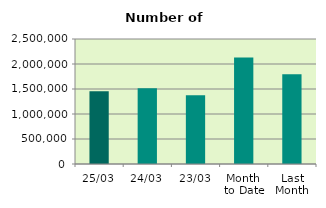
| Category | Series 0 |
|---|---|
| 25/03 | 1452588 |
| 24/03 | 1514048 |
| 23/03 | 1372664 |
| Month 
to Date | 2130990.632 |
| Last
Month | 1795830.8 |